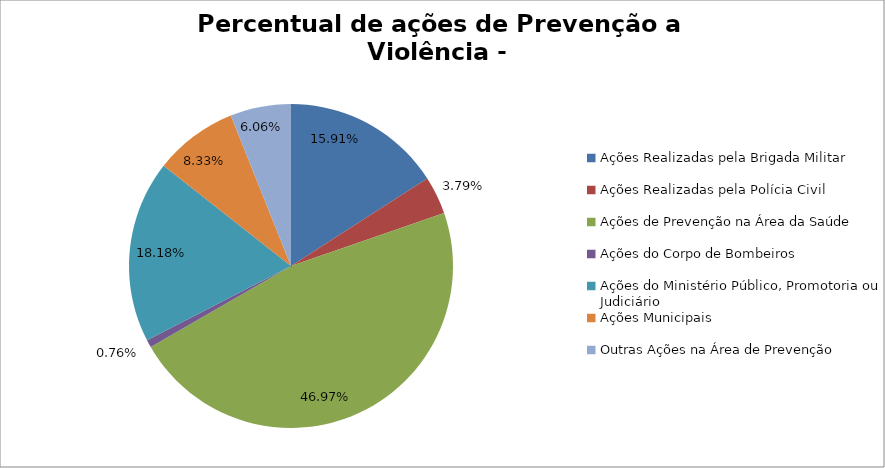
| Category | Percentual |
|---|---|
| Ações Realizadas pela Brigada Militar | 0.159 |
| Ações Realizadas pela Polícia Civil | 0.038 |
| Ações de Prevenção na Área da Saúde | 0.47 |
| Ações do Corpo de Bombeiros | 0.008 |
| Ações do Ministério Público, Promotoria ou Judiciário | 0.182 |
| Ações Municipais | 0.083 |
| Outras Ações na Área de Prevenção | 0.061 |